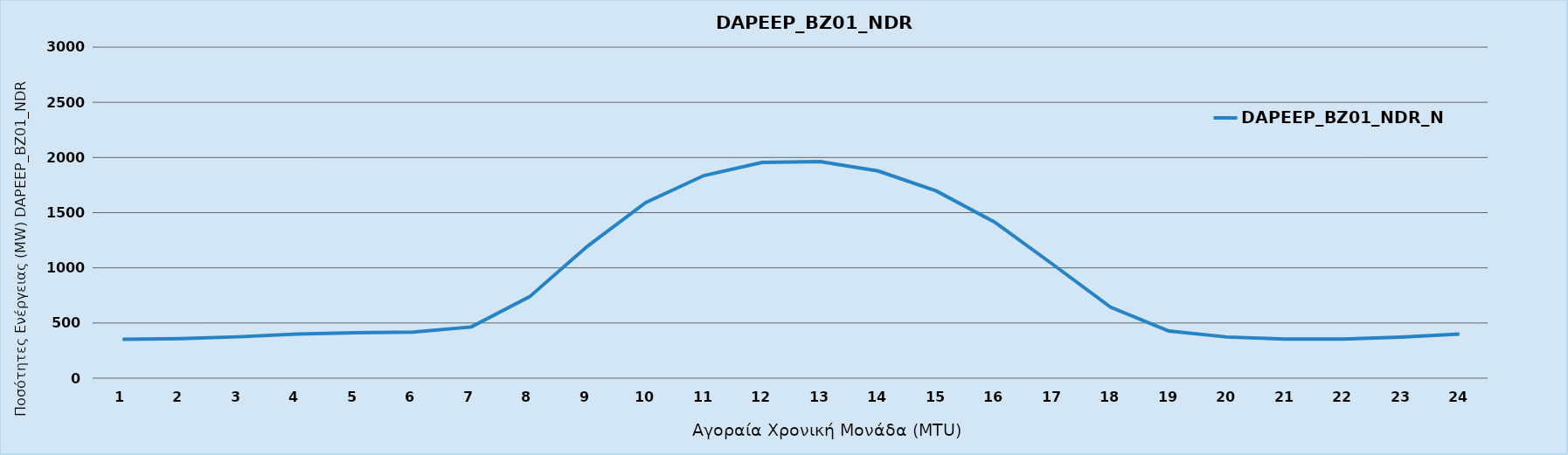
| Category | DAPEEP_BZ01_NDR_N1 |
|---|---|
| 0 | 352 |
| 1 | 359 |
| 2 | 375 |
| 3 | 399 |
| 4 | 411 |
| 5 | 417 |
| 6 | 464 |
| 7 | 737 |
| 8 | 1197 |
| 9 | 1592 |
| 10 | 1836 |
| 11 | 1955 |
| 12 | 1963 |
| 13 | 1878 |
| 14 | 1697 |
| 15 | 1415 |
| 16 | 1033 |
| 17 | 643 |
| 18 | 427 |
| 19 | 373 |
| 20 | 354 |
| 21 | 355 |
| 22 | 373 |
| 23 | 399 |